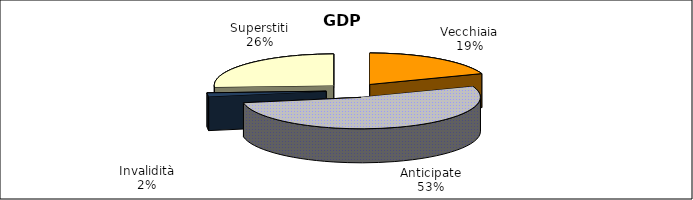
| Category | Series 0 |
|---|---|
| Vecchiaia | 22773 |
| Anticipate | 62085 |
| Invalidità | 2254 |
| Superstiti | 30336 |